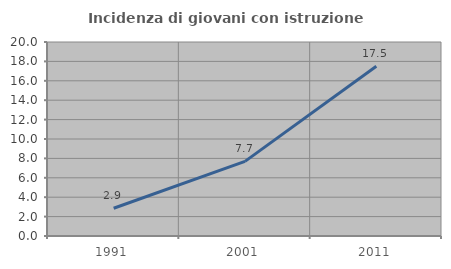
| Category | Incidenza di giovani con istruzione universitaria |
|---|---|
| 1991.0 | 2.857 |
| 2001.0 | 7.692 |
| 2011.0 | 17.5 |